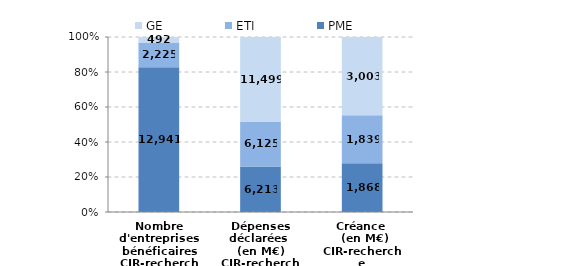
| Category | PME | ETI | GE |
|---|---|---|---|
| Nombre d'entreprises bénéficaires
CIR-recherche | 12941 | 2225 | 492 |
| Dépenses déclarées 
(en M€)
CIR-recherche | 6212.74 | 6124.63 | 11499.43 |
| Créance 
 (en M€)
CIR-recherche | 1867.67 | 1838.57 | 3003.24 |